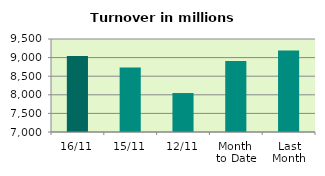
| Category | Series 0 |
|---|---|
| 16/11 | 9046.07 |
| 15/11 | 8735.157 |
| 12/11 | 8047.636 |
| Month 
to Date | 8909.024 |
| Last
Month | 9192.028 |